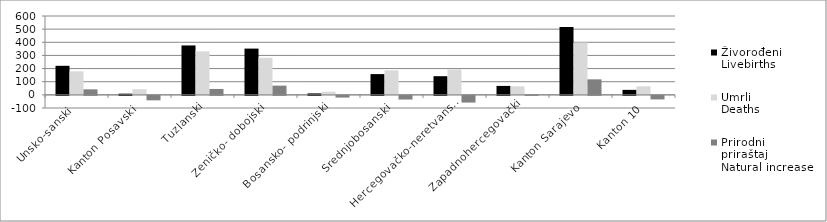
| Category | Živorođeni
Livebirths | Umrli
Deaths | Prirodni
priraštaj
Natural increase |
|---|---|---|---|
| Unsko-sanski  | 221 | 179 | 42 |
| Kanton Posavski  | 9 | 43 | -34 |
| Tuzlanski | 376 | 331 | 45 |
| Zeničko- dobojski | 352 | 282 | 70 |
| Bosansko- podrinjski | 11 | 24 | -13 |
| Srednjobosanski | 158 | 186 | -28 |
| Hercegovačko-neretvanski | 142 | 193 | -51 |
| Zapadnohercegovački | 68 | 65 | 3 |
| Kanton Sarajevo | 516 | 398 | 118 |
| Kanton 10 | 38 | 65 | -27 |